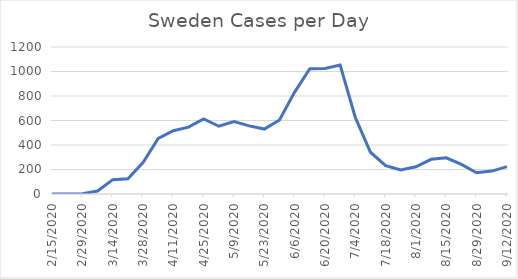
| Category | Sweden |
|---|---|
| 2/15/20 | 0 |
| 2/22/20 | 0 |
| 2/29/20 | 2 |
| 3/7/20 | 24 |
| 3/14/20 | 117 |
| 3/21/20 | 125 |
| 3/28/20 | 257 |
| 4/4/20 | 453 |
| 4/11/20 | 517 |
| 4/18/20 | 546 |
| 4/25/20 | 613 |
| 5/2/20 | 553 |
| 5/9/20 | 591 |
| 5/16/20 | 556 |
| 5/23/20 | 530 |
| 5/30/20 | 604 |
| 6/6/20 | 832 |
| 6/13/20 | 1023 |
| 6/20/20 | 1025 |
| 6/27/20 | 1052 |
| 7/4/20 | 625 |
| 7/11/20 | 341 |
| 7/18/20 | 231 |
| 7/25/20 | 197 |
| 8/1/20 | 222 |
| 8/8/20 | 283 |
| 8/15/20 | 295 |
| 8/22/20 | 242 |
| 8/29/20 | 173 |
| 9/5/20 | 187 |
| 9/12/20 | 223 |